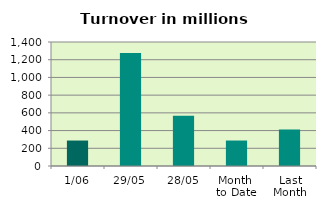
| Category | Series 0 |
|---|---|
| 1/06 | 287.611 |
| 29/05 | 1274.814 |
| 28/05 | 567.207 |
| Month 
to Date | 287.611 |
| Last
Month | 412.236 |